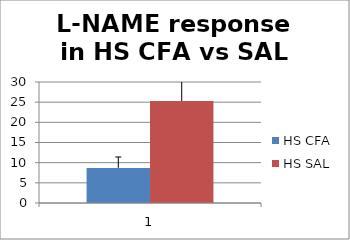
| Category | HS CFA | HS SAL |
|---|---|---|
| 0 | 8.706 | 25.288 |